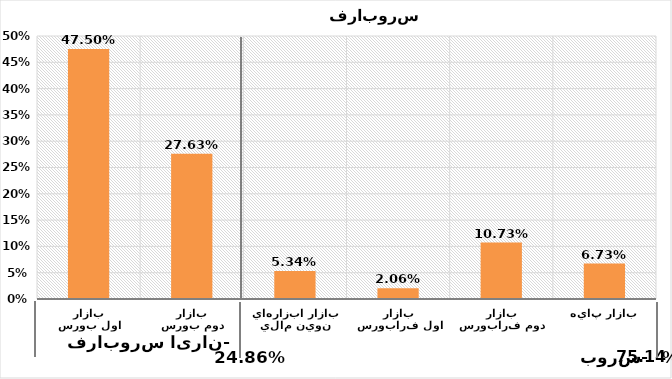
| Category | Series 0 |
|---|---|
| بازار اول بورس | 0.475 |
| بازار دوم بورس | 0.276 |
| بازار ابزارهاي نوين مالي | 0.053 |
| بازار اول فرابورس | 0.021 |
| بازار دوم فرابورس | 0.107 |
| بازار پايه | 0.067 |